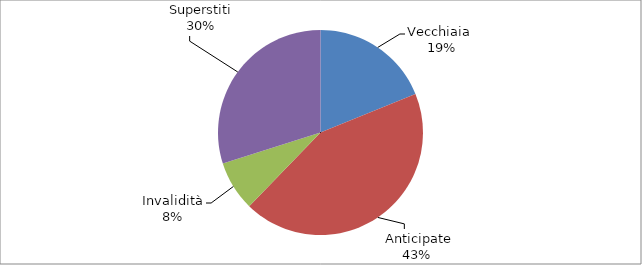
| Category | Series 0 |
|---|---|
| Vecchiaia  | 9586 |
|  Anticipate | 22067 |
| Invalidità | 3994 |
| Superstiti | 15205 |